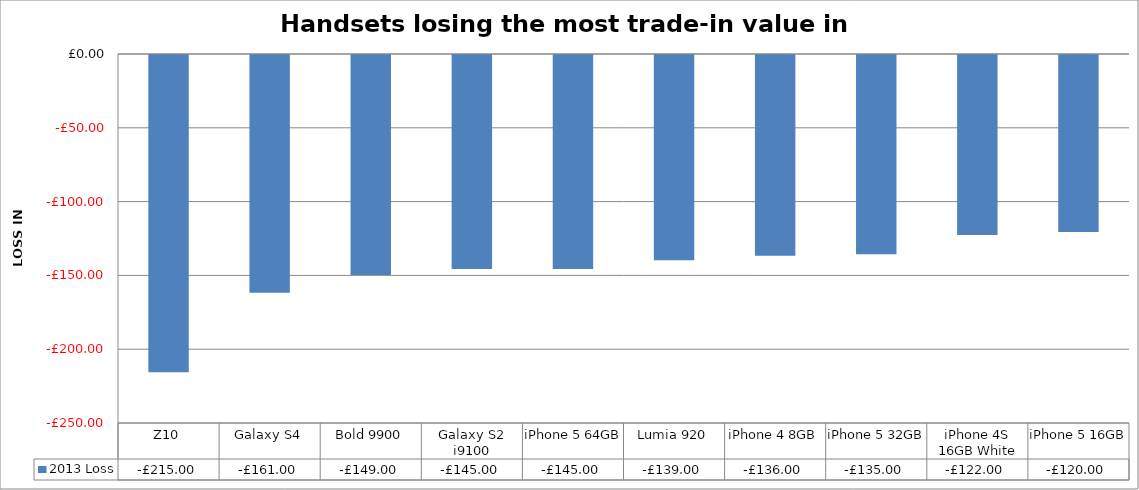
| Category | 2013 Loss |
|---|---|
| Z10 | -215 |
| Galaxy S4 | -161 |
| Bold 9900 | -149 |
| Galaxy S2 i9100 | -145 |
| iPhone 5 64GB | -145 |
| Lumia 920 | -139 |
| iPhone 4 8GB | -136 |
| iPhone 5 32GB | -135 |
| iPhone 4S 16GB White | -122 |
| iPhone 5 16GB | -120 |